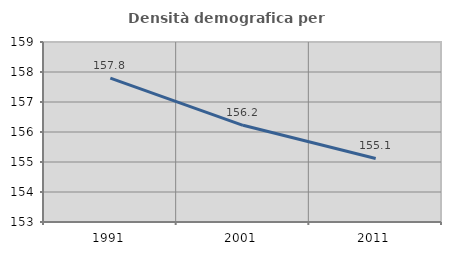
| Category | Densità demografica |
|---|---|
| 1991.0 | 157.795 |
| 2001.0 | 156.223 |
| 2011.0 | 155.119 |